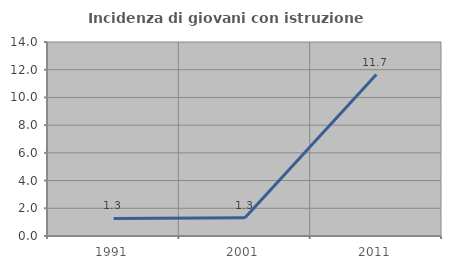
| Category | Incidenza di giovani con istruzione universitaria |
|---|---|
| 1991.0 | 1.269 |
| 2001.0 | 1.323 |
| 2011.0 | 11.653 |